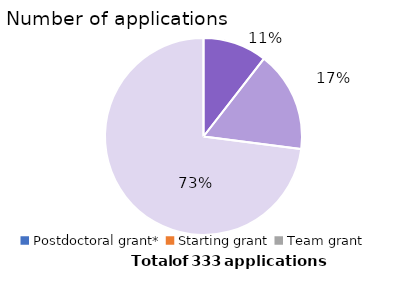
| Category | Series 1 | Series 0 |
|---|---|---|
| Postdoctoral grant* | 35 | 0.105 |
| Starting grant | 55 | 0.165 |
| Team grant | 243 | 0.73 |